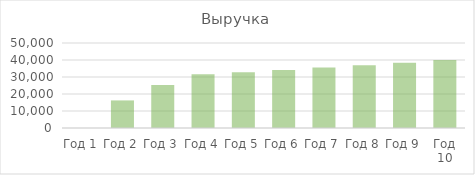
| Category | Выручка |
|---|---|
| Год 1 | 0 |
| Год 2 | 16224 |
| Год 3 | 25309.44 |
| Год 4 | 31586.181 |
| Год 5 | 32849.628 |
| Год 6 | 34163.613 |
| Год 7 | 35530.158 |
| Год 8 | 36951.364 |
| Год 9 | 38429.419 |
| Год 10 | 39966.596 |